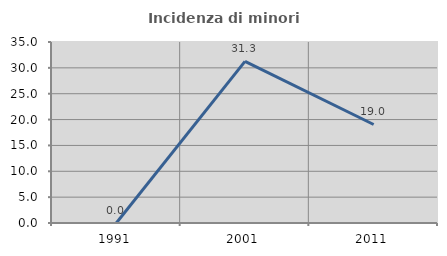
| Category | Incidenza di minori stranieri |
|---|---|
| 1991.0 | 0 |
| 2001.0 | 31.25 |
| 2011.0 | 19.048 |